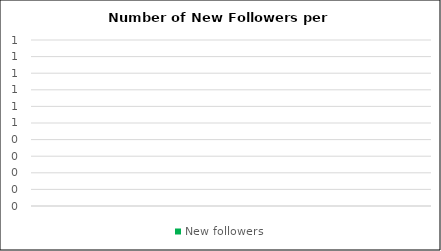
| Category | New followers |
|---|---|
| 0 | 0 |
| 1 | 0 |
| 2 | 0 |
| 3 | 0 |
| 4 | 0 |
| 5 | 0 |
| 6 | 0 |
| 7 | 0 |
| 8 | 0 |
| 9 | 0 |
| 10 | 0 |
| 11 | 0 |
| 12 | 0 |